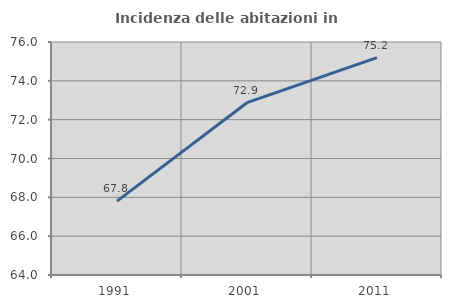
| Category | Incidenza delle abitazioni in proprietà  |
|---|---|
| 1991.0 | 67.802 |
| 2001.0 | 72.874 |
| 2011.0 | 75.194 |